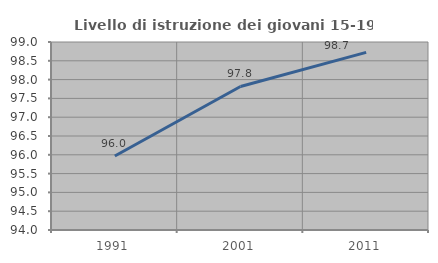
| Category | Livello di istruzione dei giovani 15-19 anni |
|---|---|
| 1991.0 | 95.969 |
| 2001.0 | 97.817 |
| 2011.0 | 98.723 |